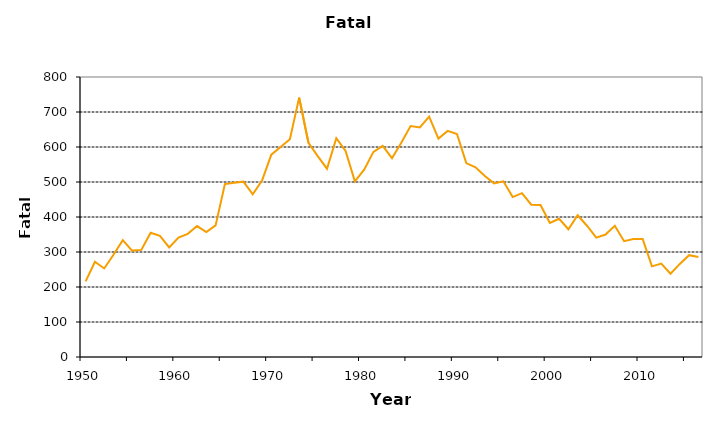
| Category | Series 1 |
|---|---|
| 1950.0 | 216.11 |
| 1951.0 | 272 |
| 1952.0 | 253 |
| 1953.0 | 292 |
| 1954.0 | 334 |
| 1955.0 | 304 |
| 1956.0 | 306 |
| 1957.0 | 355 |
| 1958.0 | 346 |
| 1959.0 | 313 |
| 1960.0 | 341 |
| 1961.0 | 352 |
| 1962.0 | 374 |
| 1963.0 | 357 |
| 1964.0 | 376 |
| 1965.0 | 494 |
| 1966.0 | 498 |
| 1967.0 | 501 |
| 1968.0 | 465 |
| 1969.0 | 504 |
| 1970.0 | 578 |
| 1971.0 | 600 |
| 1972.0 | 622 |
| 1973.0 | 741 |
| 1974.0 | 612 |
| 1975.0 | 574 |
| 1976.0 | 538 |
| 1977.0 | 625 |
| 1978.0 | 589 |
| 1979.0 | 502 |
| 1980.0 | 535 |
| 1981.0 | 586 |
| 1982.0 | 603 |
| 1983.0 | 568 |
| 1984.0 | 612 |
| 1985.0 | 660 |
| 1986.0 | 656 |
| 1987.0 | 687 |
| 1988.0 | 624 |
| 1989.0 | 646 |
| 1990.0 | 637 |
| 1991.0 | 554 |
| 1992.0 | 542 |
| 1993.0 | 517 |
| 1994.0 | 496 |
| 1995.0 | 502 |
| 1996.0 | 457 |
| 1997.0 | 468 |
| 1998.0 | 435 |
| 1999.0 | 434 |
| 2000.0 | 383 |
| 2001.0 | 395 |
| 2002.0 | 365 |
| 2003.0 | 405 |
| 2004.0 | 375 |
| 2005.0 | 341 |
| 2006.0 | 350 |
| 2007.0 | 375 |
| 2008.0 | 331 |
| 2009.0 | 337 |
| 2010.0 | 337 |
| 2011.0 | 259 |
| 2012.0 | 267 |
| 2013.0 | 238 |
| 2014.0 | 266 |
| 2015.0 | 291 |
| 2016.0 | 286 |